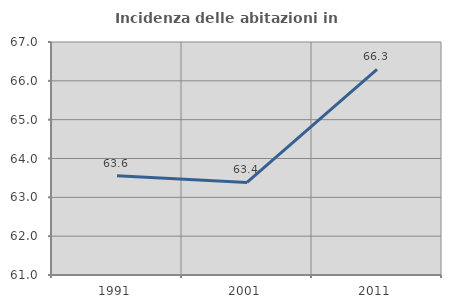
| Category | Incidenza delle abitazioni in proprietà  |
|---|---|
| 1991.0 | 63.557 |
| 2001.0 | 63.384 |
| 2011.0 | 66.292 |